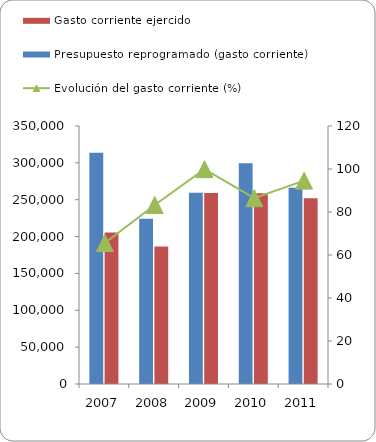
| Category | Presupuesto reprogramado (gasto corriente) | Gasto corriente ejercido |
|---|---|---|
| 2007 | 313545 | 205612 |
| 2008 | 224016 | 186516 |
| 2009 | 259279 | 259075 |
| 2010 | 299481 | 258863 |
| 2011 | 266224 | 251847 |